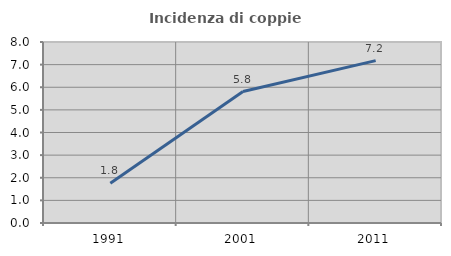
| Category | Incidenza di coppie miste |
|---|---|
| 1991.0 | 1.754 |
| 2001.0 | 5.811 |
| 2011.0 | 7.177 |